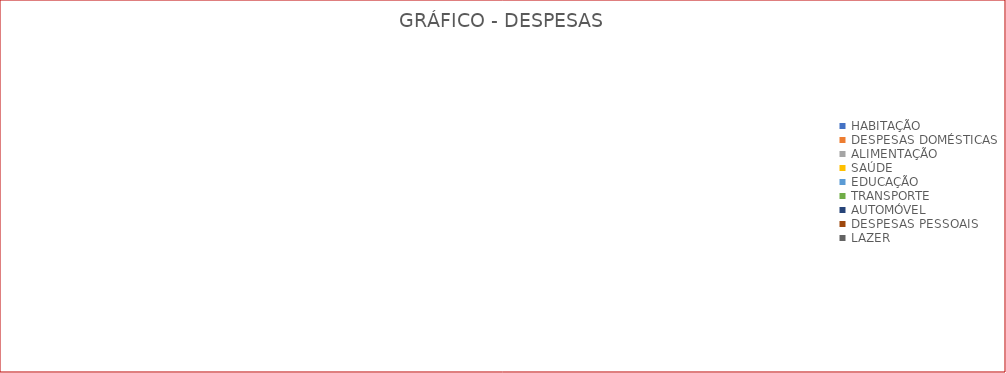
| Category | Series 0 | Series 1 |
|---|---|---|
| HABITAÇÃO | 0 |  |
| DESPESAS DOMÉSTICAS | 0 |  |
| ALIMENTAÇÃO | 0 |  |
| SAÚDE | 0 |  |
| EDUCAÇÃO | 0 |  |
| TRANSPORTE | 0 |  |
| AUTOMÓVEL | 0 |  |
| DESPESAS PESSOAIS | 0 |  |
| LAZER | 0 |  |